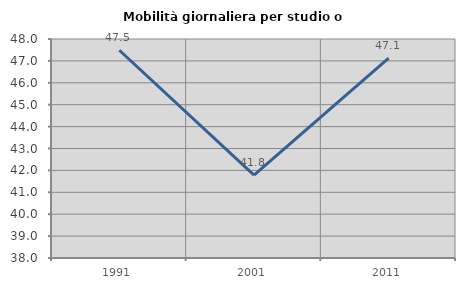
| Category | Mobilità giornaliera per studio o lavoro |
|---|---|
| 1991.0 | 47.487 |
| 2001.0 | 41.783 |
| 2011.0 | 47.131 |